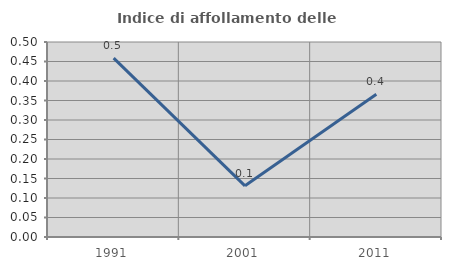
| Category | Indice di affollamento delle abitazioni  |
|---|---|
| 1991.0 | 0.459 |
| 2001.0 | 0.131 |
| 2011.0 | 0.366 |